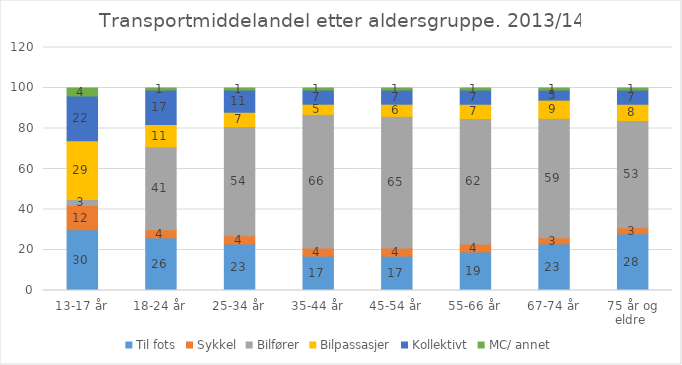
| Category | Til fots | Sykkel | Bilfører | Bilpassasjer | Kollektivt | MC/ annet |
|---|---|---|---|---|---|---|
| 13-17 år | 30 | 12 | 3 | 29 | 22 | 4 |
| 18-24 år | 26 | 4 | 41 | 11 | 17 | 1 |
| 25-34 år | 23 | 4 | 54 | 7 | 11 | 1 |
| 35-44 år | 17 | 4 | 66 | 5 | 7 | 1 |
| 45-54 år | 17 | 4 | 65 | 6 | 7 | 1 |
| 55-66 år | 19 | 4 | 62 | 7 | 7 | 1 |
| 67-74 år | 23 | 3 | 59 | 9 | 5 | 1 |
| 75 år og eldre  | 28 | 3 | 53 | 8 | 7 | 1 |